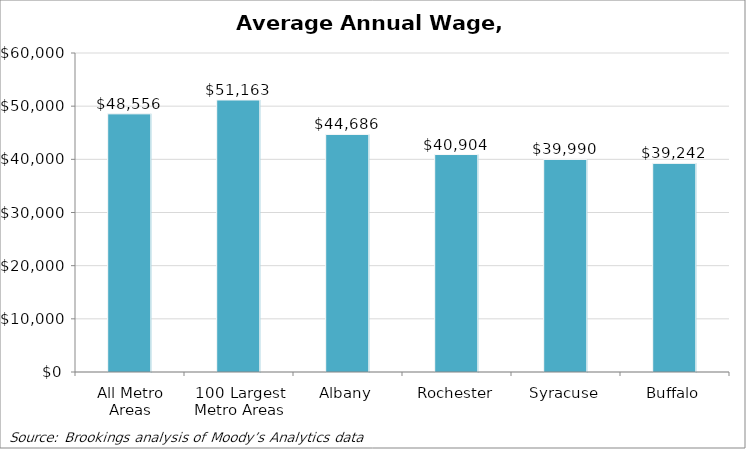
| Category | Average annual wage, 2009 |
|---|---|
| All Metro Areas | 48555.679 |
| 100 Largest Metro Areas | 51163.019 |
| Albany | 44685.846 |
| Rochester | 40904.43 |
| Syracuse | 39990.116 |
| Buffalo | 39242.463 |